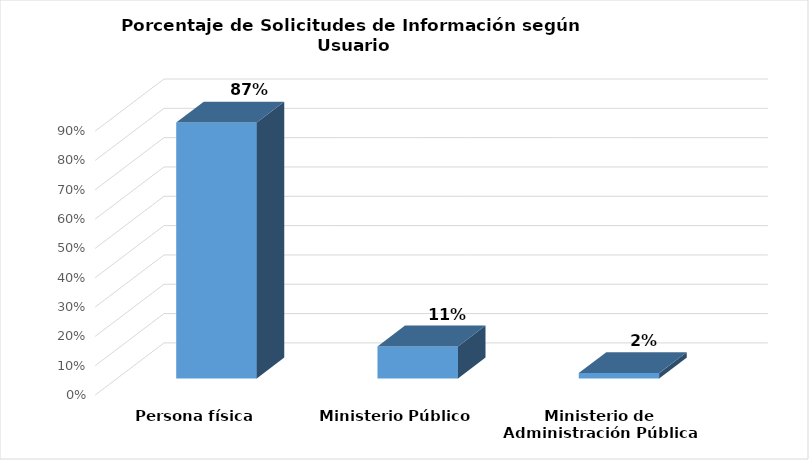
| Category | Series 0 |
|---|---|
| Persona física | 0.873 |
| Ministerio Público | 0.109 |
| Ministerio de Administración Pública | 0.018 |